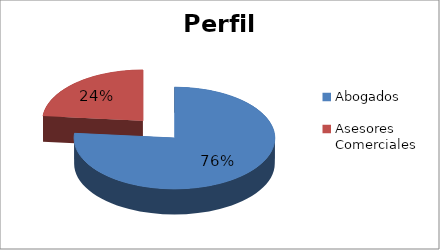
| Category | Series 0 |
|---|---|
| Abogados  | 13 |
| Asesores Comerciales  | 4 |